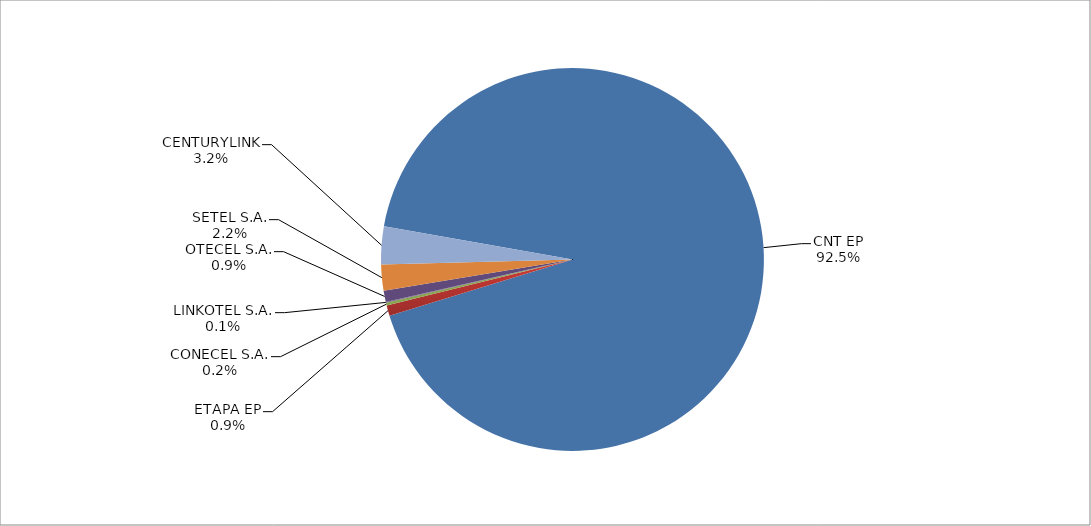
| Category | Series 0 |
|---|---|
| CNT EP | 2727 |
| ETAPA EP | 26 |
| CONECEL S.A. | 7 |
| LINKOTEL S.A. | 2 |
| OTECEL S.A. | 28 |
| SETEL S.A. | 65 |
| CENTURYLINK | 94 |